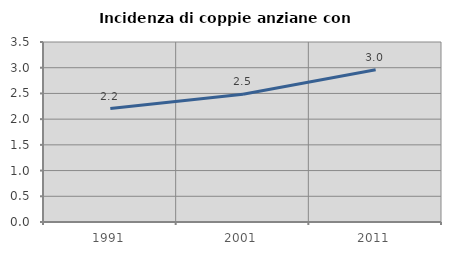
| Category | Incidenza di coppie anziane con figli |
|---|---|
| 1991.0 | 2.206 |
| 2001.0 | 2.486 |
| 2011.0 | 2.96 |